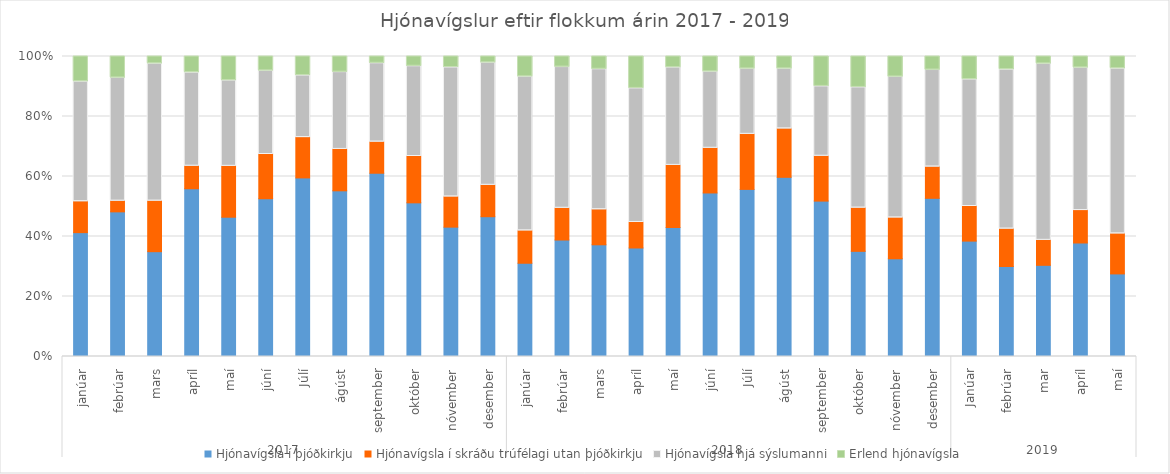
| Category | Hjónavígsla í þjóðkirkju | Hjónavígsla í skráðu trúfélagi utan þjóðkirkju | Hjónavígsla hjá sýslumanni | Erlend hjónavígsla |
|---|---|---|---|---|
| 0 | 64 | 16 | 62 | 13 |
| 1 | 54 | 4 | 46 | 8 |
| 2 | 58 | 28 | 76 | 4 |
| 3 | 104 | 14 | 58 | 10 |
| 4 | 104 | 38 | 64 | 18 |
| 5 | 264 | 74 | 140 | 24 |
| 6 | 478 | 108 | 166 | 51 |
| 7 | 296 | 74 | 138 | 28 |
| 8 | 270 | 46 | 116 | 10 |
| 9 | 126 | 38 | 74 | 8 |
| 10 | 94 | 22 | 94 | 8 |
| 11 | 178 | 40 | 156 | 8 |
| 12 | 46 | 16 | 76 | 10 |
| 13 | 66 | 18 | 80 | 6 |
| 14 | 70 | 22 | 88 | 8 |
| 15 | 68 | 16 | 84 | 20 |
| 16 | 116 | 56 | 88 | 10 |
| 17 | 278 | 76 | 130 | 26 |
| 18 | 337 | 111 | 132 | 25 |
| 19 | 436 | 118 | 146 | 30 |
| 20 | 187 | 54 | 84 | 36 |
| 21 | 68 | 28 | 78 | 20 |
| 22 | 86 | 36 | 124 | 18 |
| 23 | 222 | 44 | 136 | 19 |
| 24 | 60 | 18 | 66 | 12 |
| 25 | 48 | 20 | 85 | 7 |
| 26 | 62 | 17 | 120 | 5 |
| 27 | 70 | 20 | 88 | 7 |
| 28 | 68 | 33 | 136 | 10 |